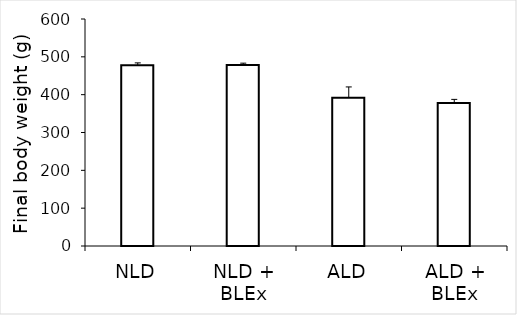
| Category | Series 0 |
|---|---|
| NLD | 477.554 |
| NLD + BLEx | 478.096 |
| ALD | 391.66 |
| ALD + BLEx | 378.052 |